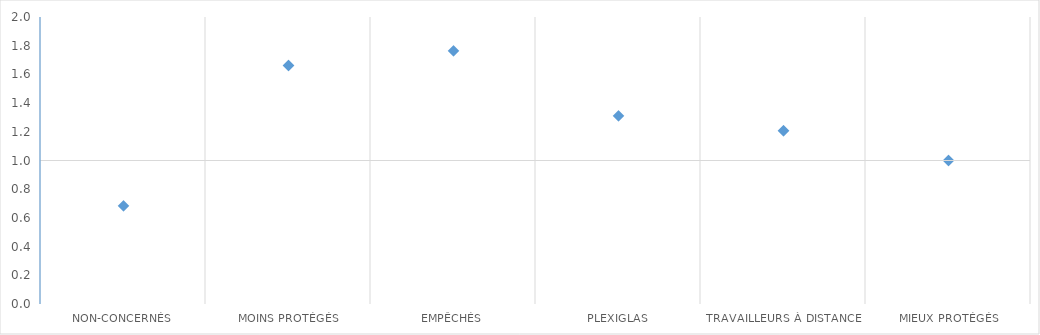
| Category | Avoir été contaminé très probablement dans le cadre du travail |
|---|---|
| Non-concernés | 0.684 |
| Moins protégés | 1.662 |
| Empêchés | 1.764 |
| Plexiglas | 1.311 |
| Travailleurs à distance | 1.207 |
| Mieux protégés | 1 |